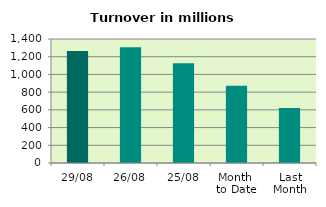
| Category | Series 0 |
|---|---|
| 29/08 | 1264.614 |
| 26/08 | 1307.902 |
| 25/08 | 1125.154 |
| Month 
to Date | 871.753 |
| Last
Month | 622.259 |